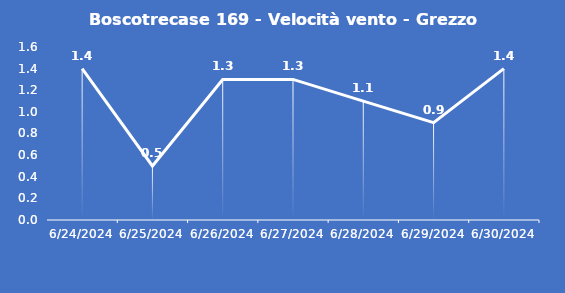
| Category | Boscotrecase 169 - Velocità vento - Grezzo (m/s) |
|---|---|
| 6/24/24 | 1.4 |
| 6/25/24 | 0.5 |
| 6/26/24 | 1.3 |
| 6/27/24 | 1.3 |
| 6/28/24 | 1.1 |
| 6/29/24 | 0.9 |
| 6/30/24 | 1.4 |